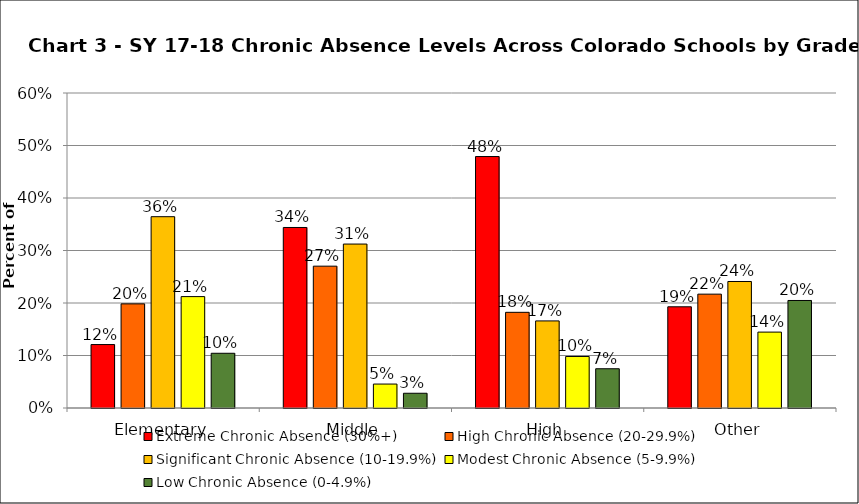
| Category | Extreme Chronic Absence (30%+) | High Chronic Absence (20-29.9%) | Significant Chronic Absence (10-19.9%) | Modest Chronic Absence (5-9.9%) | Low Chronic Absence (0-4.9%) |
|---|---|---|---|---|---|
| 0 | 0.121 | 0.198 | 0.364 | 0.212 | 0.104 |
| 1 | 0.344 | 0.27 | 0.312 | 0.046 | 0.028 |
| 2 | 0.479 | 0.182 | 0.166 | 0.098 | 0.075 |
| 3 | 0.193 | 0.217 | 0.241 | 0.145 | 0.205 |